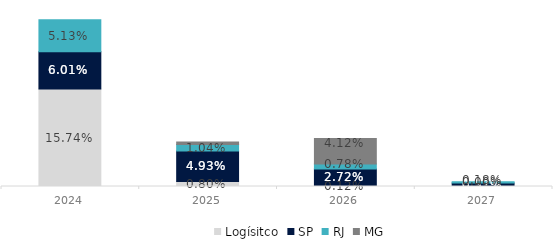
| Category | Logísitco | SP | RJ | MG |
|---|---|---|---|---|
| 2024 | 0.157 | 0.06 | 0.051 | 0 |
| 2025 | 0.008 | 0.049 | 0.01 | 0.004 |
| 2026 | 0.001 | 0.027 | 0.008 | 0.041 |
| 2027 | 0 | 0.006 | 0.002 | 0 |